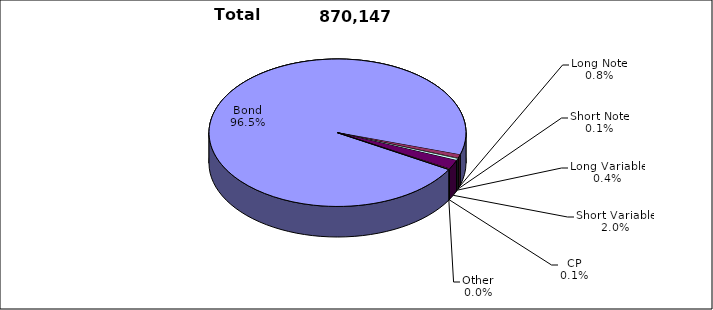
| Category | Trades |
|---|---|
| Bond | 839824 |
| Long Note | 6746 |
| Short Note | 1005 |
| Long Variable | 3539 |
| Short Variable | 17600 |
| CP | 1188 |
| Other | 245 |